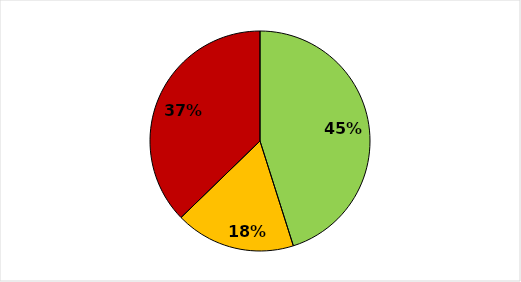
| Category | Series 0 |
|---|---|
| SUPERATI | 23 |
| PARZIAL.NTE SUPERATI | 9 |
| NON SUPERATI | 19 |